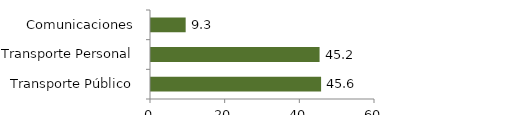
| Category | Transporte y comunicaciones |
|---|---|
| Transporte Público | 45.56 |
| Transporte Personal | 45.155 |
| Comunicaciones | 9.285 |